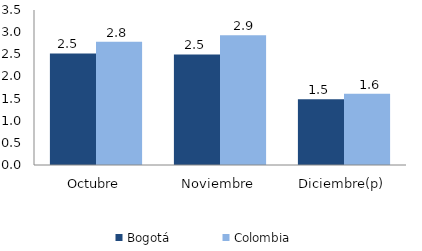
| Category | Bogotá | Colombia |
|---|---|---|
| Octubre | 2.52 | 2.784 |
| Noviembre | 2.497 | 2.929 |
| Diciembre(p) | 1.487 | 1.609 |